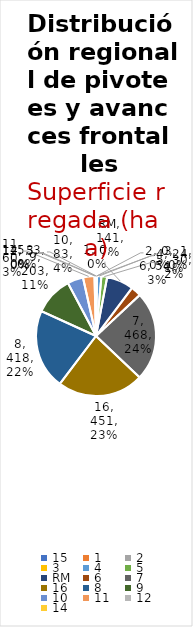
| Category | N° pivotes |
|---|---|
| 15 | 3 |
| 1 | 0 |
| 2 | 0 |
| 3 | 1 |
| 4 | 24 |
| 5 | 30 |
| RM | 141 |
| 6 | 54 |
| 7 | 468 |
| 16 | 451 |
| 8 | 418 |
| 9 | 203 |
| 10 | 83 |
| 11 | 60 |
| 12 | 5 |
| 14 | 3 |